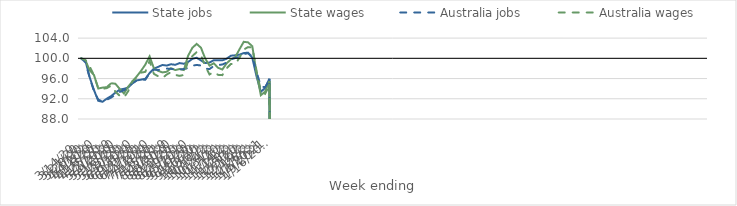
| Category | State jobs | State wages | Australia jobs | Australia wages |
|---|---|---|---|---|
| 14/03/2020 | 100 | 100 | 100 | 100 |
| 21/03/2020 | 99.572 | 99.58 | 99.215 | 99.668 |
| 28/03/2020 | 96.23 | 97.631 | 96.153 | 98.379 |
| 04/04/2020 | 93.726 | 96.703 | 93.502 | 96.626 |
| 11/04/2020 | 91.606 | 94.031 | 91.838 | 94.061 |
| 18/04/2020 | 91.401 | 94.206 | 91.448 | 93.977 |
| 25/04/2020 | 92.029 | 94.294 | 91.813 | 94.111 |
| 02/05/2020 | 92.526 | 95.079 | 92.231 | 94.578 |
| 09/05/2020 | 93.203 | 94.973 | 92.806 | 93.416 |
| 16/05/2020 | 93.801 | 93.966 | 93.353 | 92.605 |
| 23/05/2020 | 93.97 | 93.048 | 93.674 | 92.236 |
| 30/05/2020 | 94.235 | 94.397 | 94.181 | 93.508 |
| 06/06/2020 | 95.056 | 95.423 | 95.128 | 95.497 |
| 13/06/2020 | 95.636 | 96.431 | 95.639 | 96.189 |
| 20/06/2020 | 95.784 | 97.516 | 95.802 | 97.174 |
| 27/06/2020 | 95.948 | 98.764 | 95.768 | 97.323 |
| 04/07/2020 | 97.09 | 100.39 | 97.053 | 99.476 |
| 11/07/2020 | 97.948 | 98.03 | 97.772 | 96.928 |
| 18/07/2020 | 98.314 | 97.528 | 97.691 | 96.451 |
| 25/07/2020 | 98.682 | 97.213 | 97.829 | 96.097 |
| 01/08/2020 | 98.575 | 97.341 | 97.979 | 96.806 |
| 08/08/2020 | 98.829 | 98.047 | 97.922 | 97.248 |
| 15/08/2020 | 98.72 | 97.681 | 97.789 | 96.723 |
| 22/08/2020 | 99.06 | 97.883 | 97.812 | 96.531 |
| 29/08/2020 | 98.932 | 97.687 | 97.884 | 96.715 |
| 05/09/2020 | 99.28 | 100.521 | 98.101 | 99.468 |
| 12/09/2020 | 99.904 | 102.092 | 98.536 | 100.455 |
| 19/09/2020 | 100.112 | 102.856 | 98.701 | 101.226 |
| 26/09/2020 | 99.587 | 102.102 | 98.574 | 100.61 |
| 03/10/2020 | 99.063 | 99.96 | 97.954 | 98.463 |
| 10/10/2020 | 99.168 | 98.556 | 97.882 | 96.815 |
| 17/10/2020 | 99.631 | 99.025 | 98.486 | 97.316 |
| 24/10/2020 | 99.628 | 98.121 | 98.675 | 96.732 |
| 31/10/2020 | 99.6 | 97.794 | 98.779 | 96.679 |
| 07/11/2020 | 99.924 | 99.001 | 99.161 | 98.026 |
| 14/11/2020 | 100.518 | 99.796 | 99.803 | 98.893 |
| 21/11/2020 | 100.599 | 100.221 | 100.059 | 98.847 |
| 28/11/2020 | 100.724 | 101.782 | 100.31 | 100.101 |
| 05/12/2020 | 101.038 | 103.269 | 100.817 | 101.732 |
| 12/12/2020 | 101.12 | 103.162 | 101.015 | 102.219 |
| 19/12/2020 | 100.113 | 102.4 | 100.355 | 102.16 |
| 26/12/2020 | 96.419 | 97.053 | 97.322 | 97.485 |
| 02/01/2021 | 93.363 | 92.707 | 94.445 | 93.574 |
| 09/01/2021 | 94.156 | 93.418 | 94.284 | 92.978 |
| 16/01/2021 | 95.978 | 95.494 | 95.7 | 94.76 |